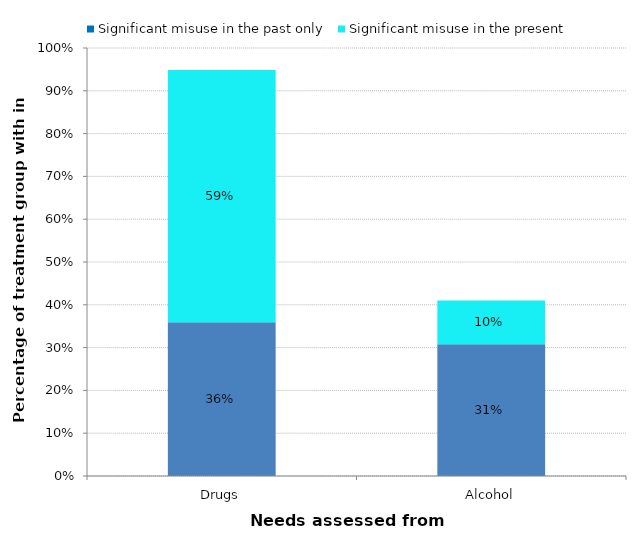
| Category | Significant misuse in the past only | Significant misuse in the present |
|---|---|---|
| Drugs | 0.359 | 0.59 |
| Alcohol | 0.308 | 0.103 |